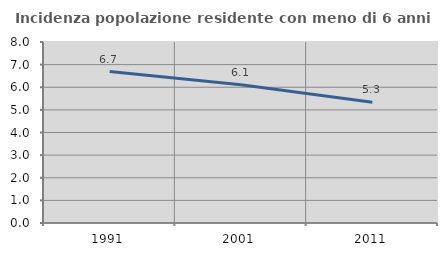
| Category | Incidenza popolazione residente con meno di 6 anni |
|---|---|
| 1991.0 | 6.695 |
| 2001.0 | 6.109 |
| 2011.0 | 5.335 |